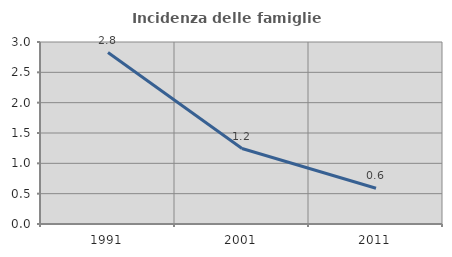
| Category | Incidenza delle famiglie numerose |
|---|---|
| 1991.0 | 2.826 |
| 2001.0 | 1.244 |
| 2011.0 | 0.59 |